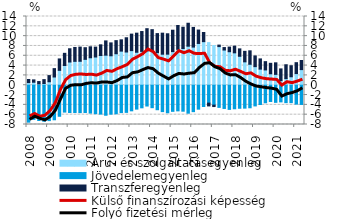
| Category | Áru- és szolgáltatásegyenleg | Jövedelemegyenleg | Transzferegyenleg |
|---|---|---|---|
| 2008.0 | 0.542 | -7.522 | 0.63 |
| 2008.0 | 0.61 | -6.953 | 0.477 |
| 2008.0 | 0.274 | -7.18 | 0.474 |
| 2008.0 | 0.347 | -7.339 | 0.794 |
| 2009.0 | 0.707 | -7.208 | 1.254 |
| 2009.0 | 1.678 | -7.037 | 1.705 |
| 2009.0 | 3.033 | -6.321 | 2.323 |
| 2009.0 | 4.018 | -5.474 | 2.481 |
| 2010.0 | 4.729 | -5.554 | 2.702 |
| 2010.0 | 4.866 | -5.56 | 2.828 |
| 2010.0 | 4.881 | -5.577 | 2.885 |
| 2010.0 | 5.27 | -5.556 | 2.375 |
| 2011.0 | 5.594 | -5.676 | 2.234 |
| 2011.0 | 5.748 | -5.797 | 2.014 |
| 2011.0 | 6.061 | -5.88 | 2.169 |
| 2011.0 | 6.121 | -6.116 | 2.908 |
| 2012.0 | 5.999 | -5.893 | 2.625 |
| 2012.0 | 6.415 | -5.818 | 2.668 |
| 2012.0 | 6.95 | -5.577 | 2.297 |
| 2012.0 | 6.767 | -5.529 | 2.903 |
| 2013.0 | 7.049 | -5.213 | 3.36 |
| 2013.0 | 6.717 | -4.866 | 3.887 |
| 2013.0 | 6.896 | -4.599 | 4.042 |
| 2013.0 | 6.986 | -4.238 | 4.531 |
| 2014.0 | 7.05 | -4.575 | 4.268 |
| 2014.0 | 6.636 | -4.987 | 3.879 |
| 2014.0 | 6.32 | -5.375 | 4.284 |
| 2014.0 | 6.328 | -5.609 | 4.153 |
| 2015.0 | 6.85 | -5.318 | 4.357 |
| 2015.0 | 7.318 | -5.223 | 4.849 |
| 2015.0 | 7.485 | -5.289 | 4.324 |
| 2015.0 | 7.95 | -5.698 | 4.676 |
| 2016.0 | 7.771 | -5.382 | 4.006 |
| 2016.0 | 8.512 | -4.875 | 2.726 |
| 2016.0 | 8.877 | -4.333 | 1.868 |
| 2016.0 | 8.682 | -3.645 | -0.57 |
| 2017.0 | 8.098 | -4.058 | -0.284 |
| 2017.0 | 7.87 | -4.512 | 0.304 |
| 2017.0 | 7.17 | -4.73 | 0.503 |
| 2017.0 | 6.827 | -4.922 | 0.942 |
| 2018.0 | 6.6 | -4.797 | 1.359 |
| 2018.0 | 5.898 | -4.692 | 1.508 |
| 2018.0 | 4.763 | -4.667 | 2.14 |
| 2018.0 | 4.27 | -4.592 | 2.736 |
| 2019.0 | 3.786 | -4.215 | 2.178 |
| 2019.0 | 3.282 | -3.932 | 2.08 |
| 2019.0 | 3.113 | -3.574 | 1.69 |
| 2019.0 | 2.332 | -3.309 | 2.13 |
| 2020.0 | 2.212 | -3.487 | 2.352 |
| 2020.0 | 0.927 | -3.394 | 2.398 |
| 2020.0 | 1.342 | -3.548 | 2.825 |
| 2020.0 | 1.724 | -3.546 | 2.246 |
| 2021.0 | 2.375 | -3.845 | 2.219 |
| 2021.0 | 3.182 | -3.918 | 1.859 |